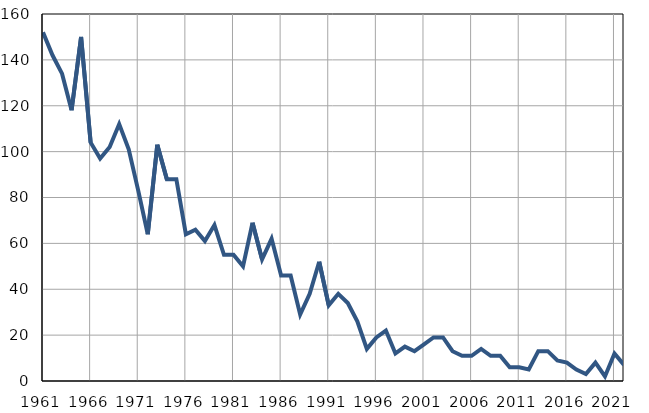
| Category | Infants
deaths |
|---|---|
| 1961.0 | 152 |
| 1962.0 | 142 |
| 1963.0 | 134 |
| 1964.0 | 118 |
| 1965.0 | 150 |
| 1966.0 | 104 |
| 1967.0 | 97 |
| 1968.0 | 102 |
| 1969.0 | 112 |
| 1970.0 | 101 |
| 1971.0 | 83 |
| 1972.0 | 64 |
| 1973.0 | 103 |
| 1974.0 | 88 |
| 1975.0 | 88 |
| 1976.0 | 64 |
| 1977.0 | 66 |
| 1978.0 | 61 |
| 1979.0 | 68 |
| 1980.0 | 55 |
| 1981.0 | 55 |
| 1982.0 | 50 |
| 1983.0 | 69 |
| 1984.0 | 53 |
| 1985.0 | 62 |
| 1986.0 | 46 |
| 1987.0 | 46 |
| 1988.0 | 29 |
| 1989.0 | 38 |
| 1990.0 | 52 |
| 1991.0 | 33 |
| 1992.0 | 38 |
| 1993.0 | 34 |
| 1994.0 | 26 |
| 1995.0 | 14 |
| 1996.0 | 19 |
| 1997.0 | 22 |
| 1998.0 | 12 |
| 1999.0 | 15 |
| 2000.0 | 13 |
| 2001.0 | 16 |
| 2002.0 | 19 |
| 2003.0 | 19 |
| 2004.0 | 13 |
| 2005.0 | 11 |
| 2006.0 | 11 |
| 2007.0 | 14 |
| 2008.0 | 11 |
| 2009.0 | 11 |
| 2010.0 | 6 |
| 2011.0 | 6 |
| 2012.0 | 5 |
| 2013.0 | 13 |
| 2014.0 | 13 |
| 2015.0 | 9 |
| 2016.0 | 8 |
| 2017.0 | 5 |
| 2018.0 | 3 |
| 2019.0 | 8 |
| 2020.0 | 2 |
| 2021.0 | 12 |
| 2022.0 | 7 |